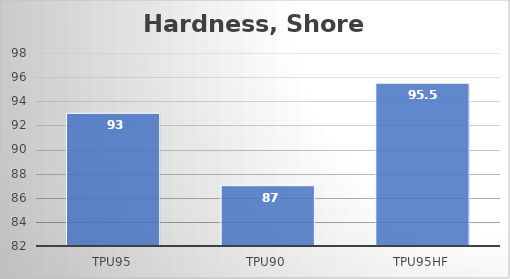
| Category | Shore A |
|---|---|
| TPU95 | 93 |
| TPU90 | 87 |
| TPU95HF | 95.5 |